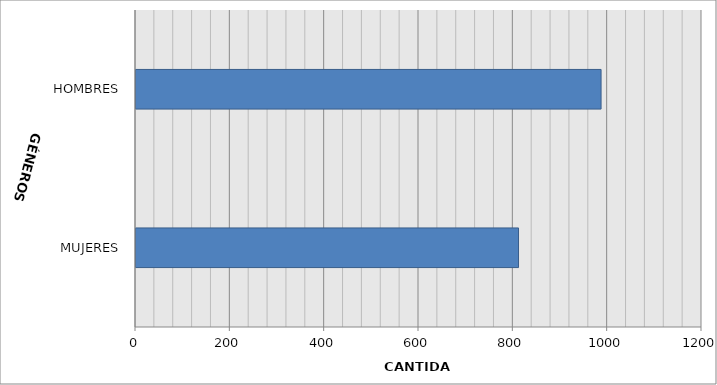
| Category | Series 0 |
|---|---|
| MUJERES | 811 |
| HOMBRES | 986 |